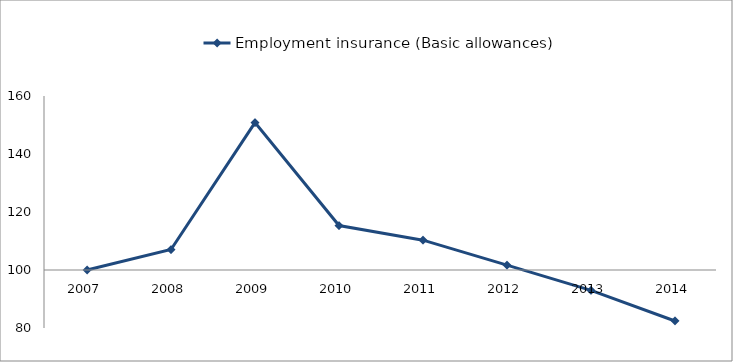
| Category | Employment insurance (Basic allowances) |
|---|---|
| 2007.0 | 100 |
| 2008.0 | 107.062 |
| 2009.0 | 150.815 |
| 2010.0 | 115.333 |
| 2011.0 | 110.286 |
| 2012.0 | 101.696 |
| 2013.0 | 92.975 |
| 2014.0 | 82.421 |